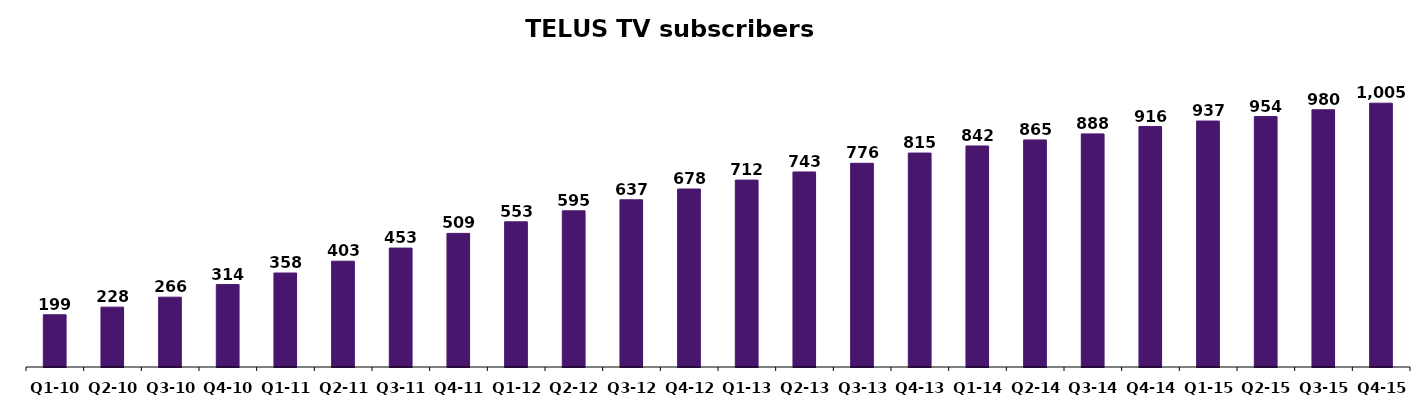
| Category | Series 0 |
|---|---|
| Q1-10 | 199 |
| Q2-10 | 228 |
| Q3-10 | 266 |
| Q4-10 | 314 |
| Q1-11 | 358 |
| Q2-11 | 403 |
| Q3-11 | 453 |
| Q4-11 | 509 |
| Q1-12 | 553 |
| Q2-12 | 595 |
| Q3-12 | 637 |
| Q4-12 | 678 |
| Q1-13 | 712 |
| Q2-13 | 743 |
| Q3-13 | 776 |
| Q4-13 | 815 |
| Q1-14 | 842 |
| Q2-14 | 865 |
| Q3-14 | 888 |
| Q4-14 | 916 |
| Q1-15 | 937 |
| Q2-15 | 954 |
| Q3-15 | 980 |
| Q4-15 | 1005 |